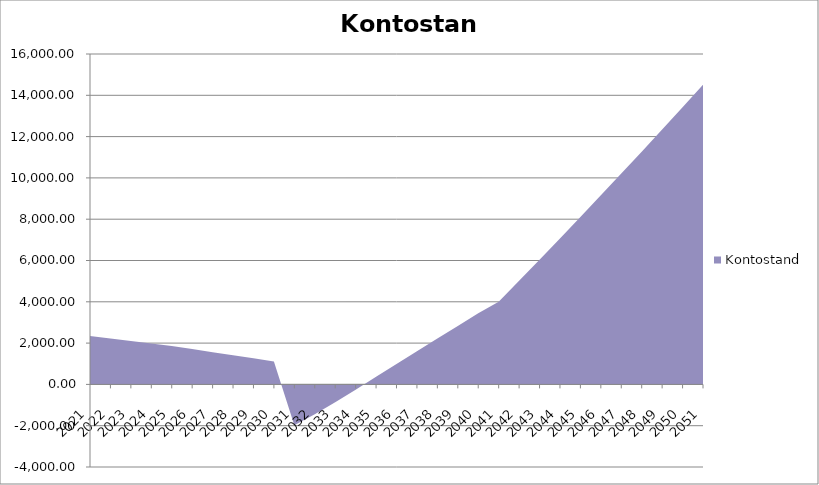
| Category | Kontostand |
|---|---|
| 2021-01-01 | 2345.178 |
| 2022-01-01 | 2223.13 |
| 2023-01-01 | 2101.535 |
| 2024-01-01 | 1981.357 |
| 2025-01-01 | 1861.558 |
| 2026-01-01 | 1711.098 |
| 2027-01-01 | 1560.937 |
| 2028-01-01 | 1411.033 |
| 2029-01-01 | 1261.343 |
| 2030-01-01 | 1112.822 |
| 2031-01-01 | -1977.103 |
| 2032-01-01 | -1440.168 |
| 2033-01-01 | -868.067 |
| 2034-01-01 | -259.173 |
| 2035-01-01 | 364.525 |
| 2036-01-01 | 985.083 |
| 2037-01-01 | 1603.45 |
| 2038-01-01 | 2218.569 |
| 2039-01-01 | 2831.385 |
| 2040-01-01 | 3440.84 |
| 2041-01-01 | 4004.875 |
| 2042-01-01 | 5018.705 |
| 2043-01-01 | 6041.087 |
| 2044-01-01 | 7071.081 |
| 2045-01-01 | 8108.746 |
| 2046-01-01 | 9155.14 |
| 2047-01-01 | 10209.323 |
| 2048-01-01 | 11271.351 |
| 2049-01-01 | 12342.285 |
| 2050-01-01 | 13421.181 |
| 2051-01-01 | 14508.099 |